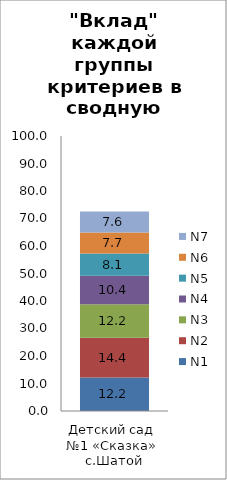
| Category | N1 | N2 | N3 | N4 | N5 | N6 | N7 |
|---|---|---|---|---|---|---|---|
| Детский сад  №1 «Сказка»  с.Шатой | 12.211 | 14.385 | 12.205 | 10.367 | 8.092 | 7.657 | 7.627 |